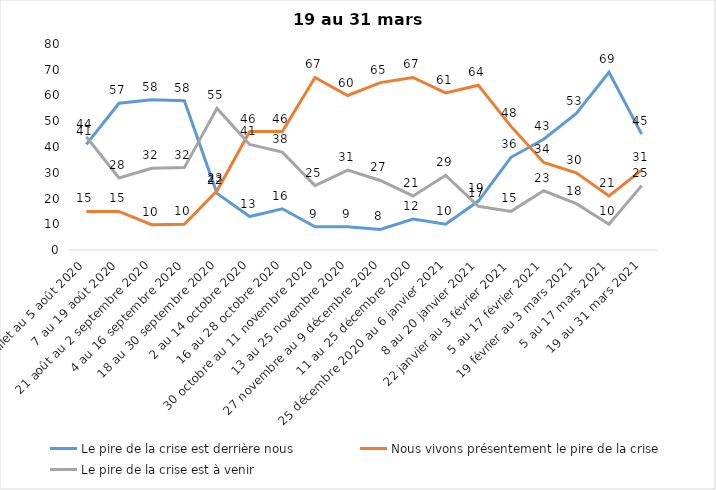
| Category | Le pire de la crise est derrière nous | Nous vivons présentement le pire de la crise | Le pire de la crise est à venir |
|---|---|---|---|
| 24 juillet au 5 août 2020 | 41 | 15 | 44 |
| 7 au 19 août 2020 | 57 | 15 | 28 |
| 21 août au 2 septembre 2020 | 58.39 | 9.84 | 31.77 |
| 4 au 16 septembre 2020 | 58 | 10 | 32 |
| 18 au 30 septembre 2020 | 22 | 23 | 55 |
| 2 au 14 octobre 2020 | 13 | 46 | 41 |
| 16 au 28 octobre 2020 | 16 | 46 | 38 |
| 30 octobre au 11 novembre 2020 | 9 | 67 | 25 |
| 13 au 25 novembre 2020 | 9 | 60 | 31 |
| 27 novembre au 9 décembre 2020 | 8 | 65 | 27 |
| 11 au 25 décembre 2020 | 12 | 67 | 21 |
| 25 décembre 2020 au 6 janvier 2021 | 10 | 61 | 29 |
| 8 au 20 janvier 2021 | 19 | 64 | 17 |
| 22 janvier au 3 février 2021 | 36 | 48 | 15 |
| 5 au 17 février 2021 | 43 | 34 | 23 |
| 19 février au 3 mars 2021 | 53 | 30 | 18 |
| 5 au 17 mars 2021 | 69 | 21 | 10 |
| 19 au 31 mars 2021 | 45 | 31 | 25 |